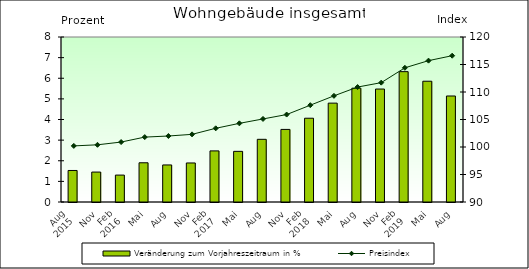
| Category | Veränderung zum Vorjahreszeitraum in % |
|---|---|
| 0 | 1.529 |
| 1 | 1.451 |
| 2 | 1.305 |
| 3 | 1.902 |
| 4 | 1.796 |
| 5 | 1.892 |
| 6 | 2.478 |
| 7 | 2.456 |
| 8 | 3.039 |
| 9 | 3.519 |
| 10 | 4.062 |
| 11 | 4.794 |
| 12 | 5.519 |
| 13 | 5.477 |
| 14 | 6.32 |
| 15 | 5.855 |
| 16 | 5.14 |